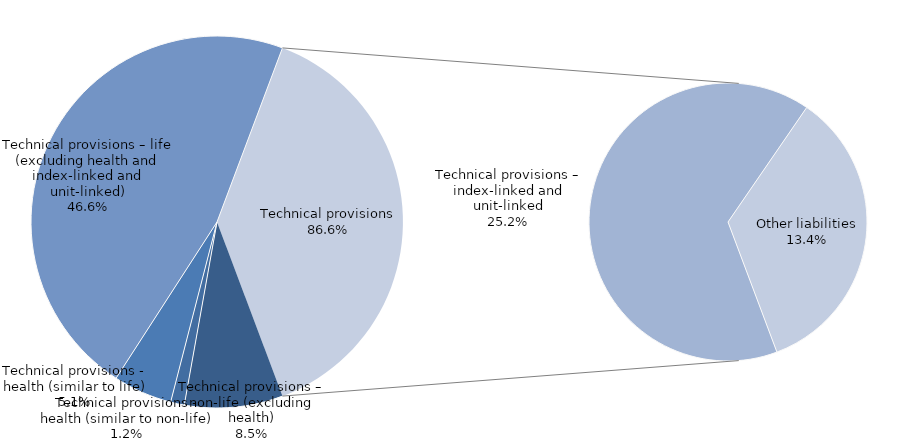
| Category | Series 0 |
|---|---|
| Technical provisions – non-life (excluding health) | 666974.28 |
| Technical provisions - health (similar to non-life) | 93268.7 |
| Technical provisions - health (similar to life) | 399639.84 |
| Technical provisions – life (excluding health and index-linked and unit-linked) | 3638618.58 |
| Technical provisions – index-linked and unit-linked | 1965852.36 |
| Other liabilities | 1044314.17 |